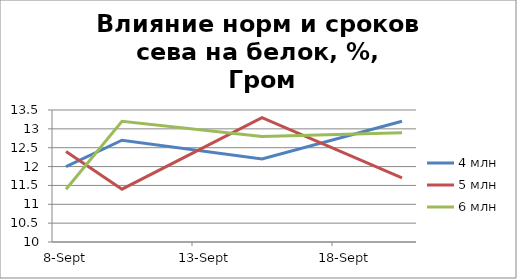
| Category | 4 млн | 5 млн | 6 млн |
|---|---|---|---|
| 2016-09-08 | 12 | 12.4 | 11.4 |
| 2016-09-10 | 12.7 | 11.4 | 13.2 |
| 2016-09-15 | 12.2 | 13.3 | 12.8 |
| 2016-09-20 | 13.2 | 11.7 | 12.9 |